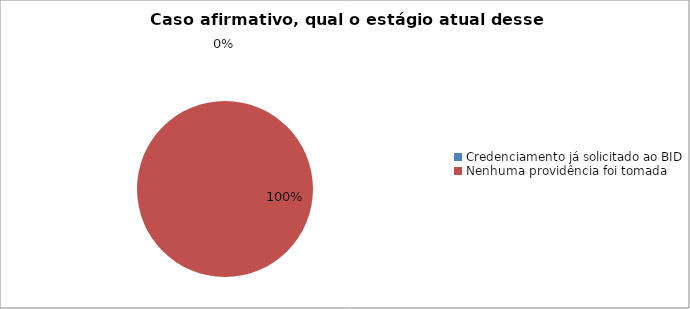
| Category | Series 0 |
|---|---|
| Credenciamento já solicitado ao BID | 0 |
| Nenhuma providência foi tomada | 1 |